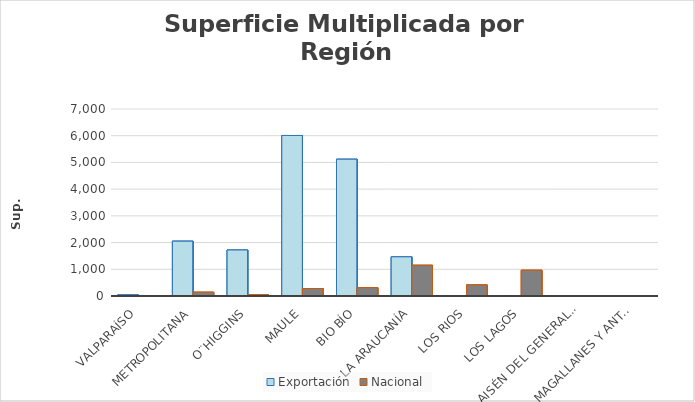
| Category | Exportación | Nacional |
|---|---|---|
| Valparaíso | 42.43 | 0 |
| Metropolitana | 2052.216 | 143 |
| O¨Higgins | 1721.722 | 48 |
| Maule | 6008.45 | 280.56 |
| Bio Bío | 5120.68 | 310.414 |
| La Araucanía | 1466.37 | 1151.262 |
| Los Rios | 0 | 415.38 |
| Los Lagos | 0 | 965.622 |
| Aisén del General Carlos Ibanez del Campo  | 0 | 0 |
| Magallanes y Antartica Chilena | 0 | 0 |